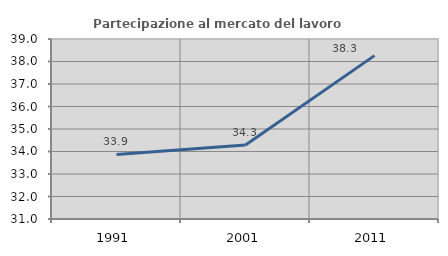
| Category | Partecipazione al mercato del lavoro  femminile |
|---|---|
| 1991.0 | 33.867 |
| 2001.0 | 34.294 |
| 2011.0 | 38.26 |